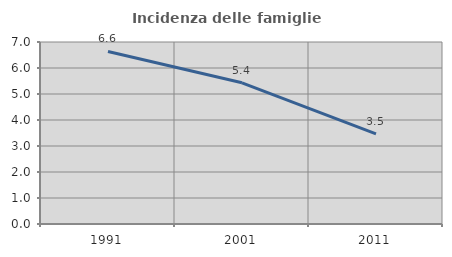
| Category | Incidenza delle famiglie numerose |
|---|---|
| 1991.0 | 6.637 |
| 2001.0 | 5.43 |
| 2011.0 | 3.463 |